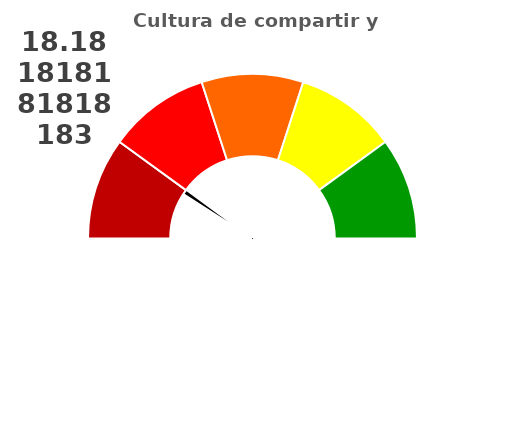
| Category | refeeee |
|---|---|
| 0 | 18.182 |
| 1 | 2 |
| 2 | 179.818 |